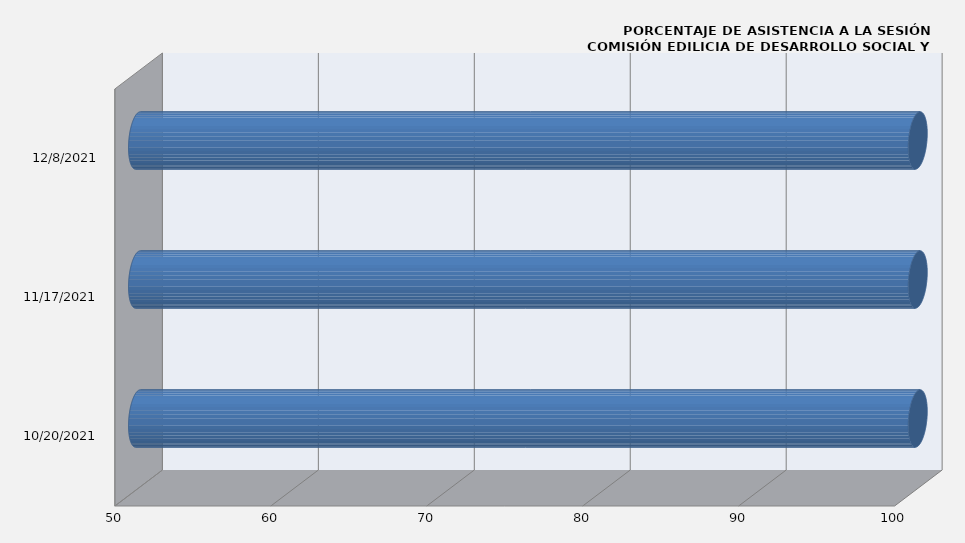
| Category | Series 0 |
|---|---|
| 10/20/21 | 100 |
| 11/17/21 | 100 |
| 12/8/21 | 100 |